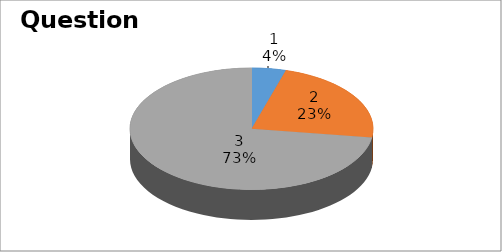
| Category | Series 0 |
|---|---|
| 0 | 1 |
| 1 | 5 |
| 2 | 16 |